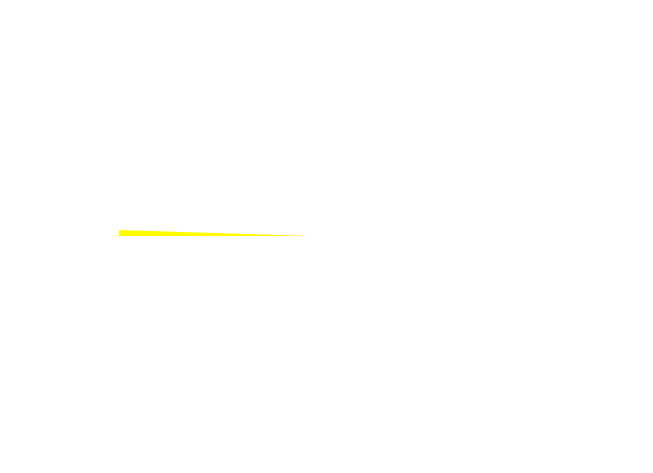
| Category | Series 0 |
|---|---|
| gv  | 0 |
| gv+ | 3 |
| end | 597 |